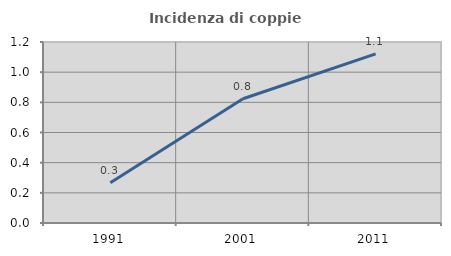
| Category | Incidenza di coppie miste |
|---|---|
| 1991.0 | 0.267 |
| 2001.0 | 0.824 |
| 2011.0 | 1.121 |